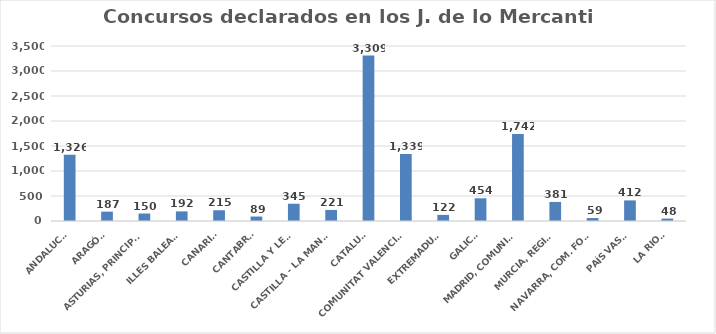
| Category | Series 0 |
|---|---|
| ANDALUCÍA | 1326 |
| ARAGÓN | 187 |
| ASTURIAS, PRINCIPADO | 150 |
| ILLES BALEARS | 192 |
| CANARIAS | 215 |
| CANTABRIA | 89 |
| CASTILLA Y LEÓN | 345 |
| CASTILLA - LA MANCHA | 221 |
| CATALUÑA | 3309 |
| COMUNITAT VALENCIANA | 1339 |
| EXTREMADURA | 122 |
| GALICIA | 454 |
| MADRID, COMUNIDAD | 1742 |
| MURCIA, REGIÓN | 381 |
| NAVARRA, COM. FORAL | 59 |
| PAÍS VASCO | 412 |
| LA RIOJA | 48 |